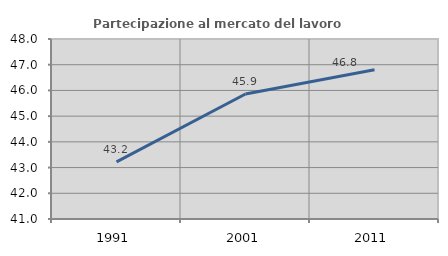
| Category | Partecipazione al mercato del lavoro  femminile |
|---|---|
| 1991.0 | 43.22 |
| 2001.0 | 45.86 |
| 2011.0 | 46.806 |